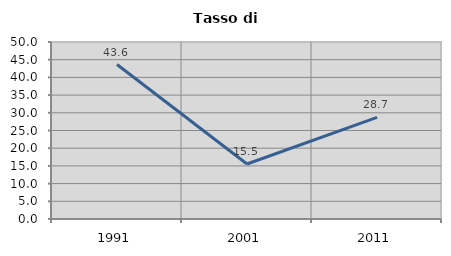
| Category | Tasso di disoccupazione   |
|---|---|
| 1991.0 | 43.644 |
| 2001.0 | 15.541 |
| 2011.0 | 28.718 |